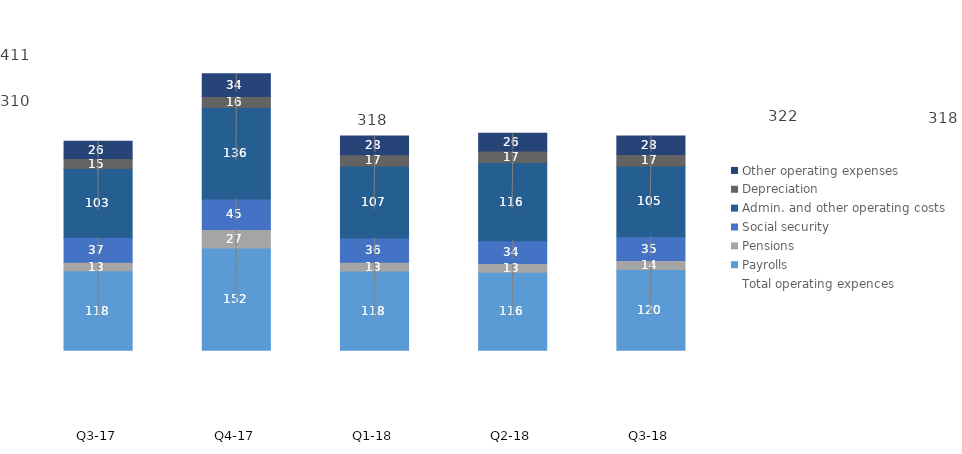
| Category | Payrolls | Pensions | Social security | Admin. and other operating costs | Depreciation | Other operating expenses |
|---|---|---|---|---|---|---|
| Q3-18 | 119.65 | 13.542 | 35.208 | 105.09 | 17.18 | 27.579 |
| Q2-18 | 115.69 | 12.848 | 33.982 | 116.179 | 17.17 | 26.198 |
| Q1-18 | 117.7 | 13 | 35.9 | 107 | 16.7 | 27.8 |
| Q4-17 | 151.8 | 27.4 | 45.2 | 136 | 16.4 | 33.9 |
| Q3-17 | 117.8 | 12.6 | 36.8 | 102.6 | 14.8 | 25.6 |